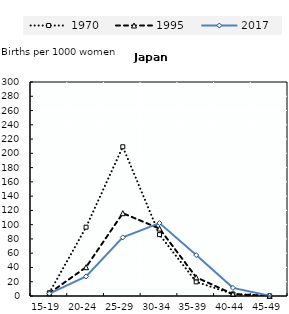
| Category | 1970 | 1995 | 2017 |
|---|---|---|---|
| 15-19 | 4.5 | 3.9 | 3.4 |
| 20-24 | 96.5 | 40.4 | 27.5 |
| 25-29 | 209.2 | 116.1 | 82.1 |
| 30-34 | 86 | 94.5 | 102.2 |
| 35-39 | 19.8 | 26.2 | 57.4 |
| 40-44 | 2.7 | 2.8 | 11.4 |
| 45-49 | 0.2 | 0.1 | 0.3 |